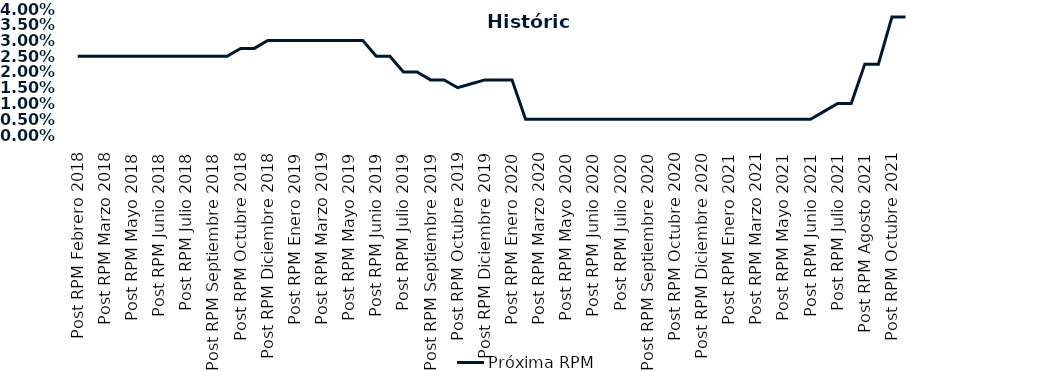
| Category | Próxima RPM |
|---|---|
| Post RPM Febrero 2018 | 0.025 |
| Pre RPM Marzo 2018 | 0.025 |
| Post RPM Marzo 2018 | 0.025 |
| Pre RPM Mayo 2018 | 0.025 |
| Post RPM Mayo 2018 | 0.025 |
| Pre RPM Junio 2018 | 0.025 |
| Post RPM Junio 2018 | 0.025 |
| Pre RPM Julio 2018 | 0.025 |
| Post RPM Julio 2018 | 0.025 |
| Pre RPM Septiembre 2018 | 0.025 |
| Post RPM Septiembre 2018 | 0.025 |
| Pre RPM Octubre 2018 | 0.025 |
| Post RPM Octubre 2018 | 0.028 |
| Pre RPM Diciembre 2018 | 0.028 |
| Post RPM Diciembre 2018 | 0.03 |
| Pre RPM Enero 2019 | 0.03 |
| Post RPM Enero 2019 | 0.03 |
| Pre RPM Marzo 2019 | 0.03 |
| Post RPM Marzo 2019 | 0.03 |
| Pre RPM Mayo 2019 | 0.03 |
| Post RPM Mayo 2019 | 0.03 |
| Pre RPM Junio 2019 | 0.03 |
| Post RPM Junio 2019 | 0.025 |
| Pre RPM Julio 2019 | 0.025 |
| Post RPM Julio 2019 | 0.02 |
| Pre RPM Septiembre 2019 | 0.02 |
| Post RPM Septiembre 2019 | 0.018 |
| Pre RPM Octubre 2019 | 0.018 |
| Post RPM Octubre 2019 | 0.015 |
| Pre RPM Diciembre 2019 | 0.016 |
| Post RPM Diciembre 2019 | 0.018 |
| Pre RPM Enero 2020 | 0.018 |
| Post RPM Enero 2020 | 0.018 |
| Pre RPM Marzo 2020 | 0.005 |
| Post RPM Marzo 2020 | 0.005 |
| Pre RPM Mayo 2020 | 0.005 |
| Post RPM Mayo 2020 | 0.005 |
| Pre RPM Junio 2020 | 0.005 |
| Post RPM Junio 2020 | 0.005 |
| Pre RPM Julio 2020 | 0.005 |
| Post RPM Julio 2020 | 0.005 |
| Pre RPM Septiembre 2020 | 0.005 |
| Post RPM Septiembre 2020 | 0.005 |
| Pre RPM Octubre 2020 | 0.005 |
| Post RPM Octubre 2020 | 0.005 |
| Pre RPM Diciembre 2020 | 0.005 |
| Post RPM Diciembre 2020 | 0.005 |
| Pre RPM Enero 2021 | 0.005 |
| Post RPM Enero 2021 | 0.005 |
| Pre RPM Marzo 2021 | 0.005 |
| Post RPM Marzo 2021 | 0.005 |
| Pre RPM Mayo 2021 | 0.005 |
| Post RPM Mayo 2021 | 0.005 |
| Pre RPM Junio 2021 | 0.005 |
| Post RPM Junio 2021 | 0.005 |
| Pre RPM Julio 2021 | 0.008 |
| Post RPM Julio 2021 | 0.01 |
| Pre RPM Agosto 2021 | 0.01 |
| Post RPM Agosto 2021 | 0.022 |
| Pre RPM Octubre 2021 | 0.022 |
| Post RPM Octubre 2021 | 0.038 |
| Pre RPM Diciembre 2021 | 0.038 |